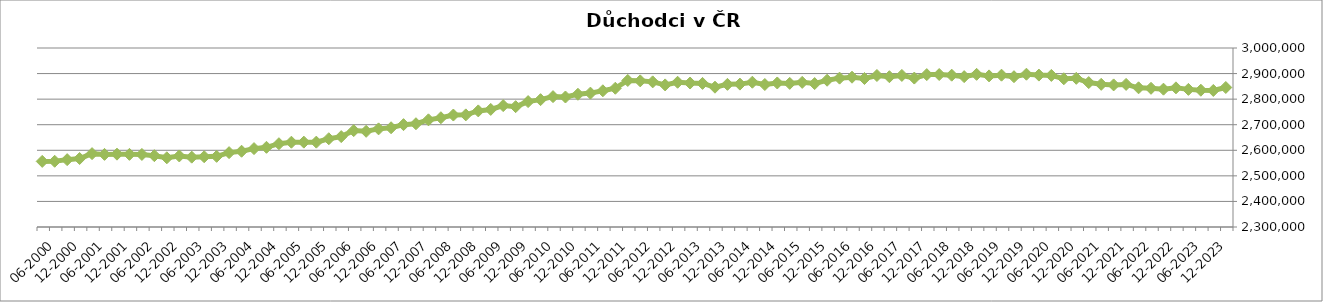
| Category | Důchodci celkem |
|---|---|
| 12-2023 | 2845583 |
| 09-2023 | 2833931 |
| 06-2023 | 2834958 |
| 03-2023 | 2838175 |
| 12-2022 | 2844180 |
| 09-2022 | 2838955 |
| 06-2022 | 2842456 |
| 03-2022 | 2844309 |
| 12-2021 | 2857644 |
| 09-2021 | 2855669 |
| 06-2021 | 2857971 |
| 03-2021 | 2864719 |
| 12-2020 | 2881424 |
| 09-2020 | 2879686 |
| 06-2020 | 2892823 |
| 03-2020 | 2894058 |
| 12-2019 | 2897527 |
| 09-2019 | 2887695 |
| 06-2019 | 2893634 |
| 03-2019 | 2890927 |
| 12-2018 | 2896973 |
| 09-2018 | 2888033 |
| 06-2018 | 2893665 |
| 03-2018 | 2896292 |
| 12-2017 | 2895963 |
| 09-2017 | 2882415 |
| 06-2017 | 2892765 |
| 03-2017 | 2887731 |
| 12-2016 | 2892469 |
| 09-2016 | 2880677 |
| 06-2016 | 2885753 |
| 03-2016 | 2882164 |
| 12-2015 | 2873953 |
| 09-2015 | 2860813 |
| 06-2015 | 2865566 |
| 03-2015 | 2861611 |
| 12-2014 | 2863210 |
| 09-2014 | 2857229 |
| 06-2014 | 2866146 |
| 03-2014 | 2858820 |
| 12-2013 | 2857856 |
| 09-2013 | 2846736 |
| 06-2013 | 2861513 |
| 03-2013 | 2863034 |
| 12-2012 | 2866056 |
| 09-2012 | 2855623 |
| 06-2012 | 2867553 |
| 03-2012 | 2871453 |
| 12-2011 | 2873004 |
| 09-2011 | 2842624 |
| 06-2011 | 2832699 |
| 03-2011 | 2823583 |
| 12-2010 | 2819093 |
| 09-2010 | 2808379 |
| 06-2010 | 2809816 |
| 03-2010 | 2797939 |
| 12-2009 | 2790391 |
| 09-2009 | 2770585 |
| 06-2009 | 2774751 |
| 03-2009 | 2759803 |
| 12-2008 | 2754011 |
| 09-2008 | 2738474 |
| 06-2008 | 2737848 |
| 03-2008 | 2727240 |
| 12-2007 | 2719161 |
| 09-2007 | 2703847 |
| 06-2007 | 2700296 |
| 03-2007 | 2688078 |
| 12-2006 | 2683784 |
| 09-2006 | 2674191 |
| 06-2006 | 2676952 |
| 03-2006 | 2653503 |
| 12-2005 | 2645100 |
| 09-2005 | 2631838 |
| 06-2005 | 2631911 |
| 03-2005 | 2631601 |
| 12-2004 | 2625685 |
| 09-2004 | 2611669 |
| 06-2004 | 2606596 |
| 03-2004 | 2596243 |
| 12-2003 | 2590844 |
| 09-2003 | 2576302 |
| 06-2003 | 2574725 |
| 03-2003 | 2573082 |
| 12-2002 | 2577798 |
| 09-2002 | 2570679 |
| 06-2002 | 2578944 |
| 03-2002 | 2583717 |
| 12-2001 | 2584018 |
| 09-2001 | 2584828 |
| 06-2001 | 2583931 |
| 03-2001 | 2586893 |
| 12-2000 | 2567865 |
| 09-2000 | 2563400 |
| 06-2000 | 2557012 |
| 03-2000 | 2556586 |